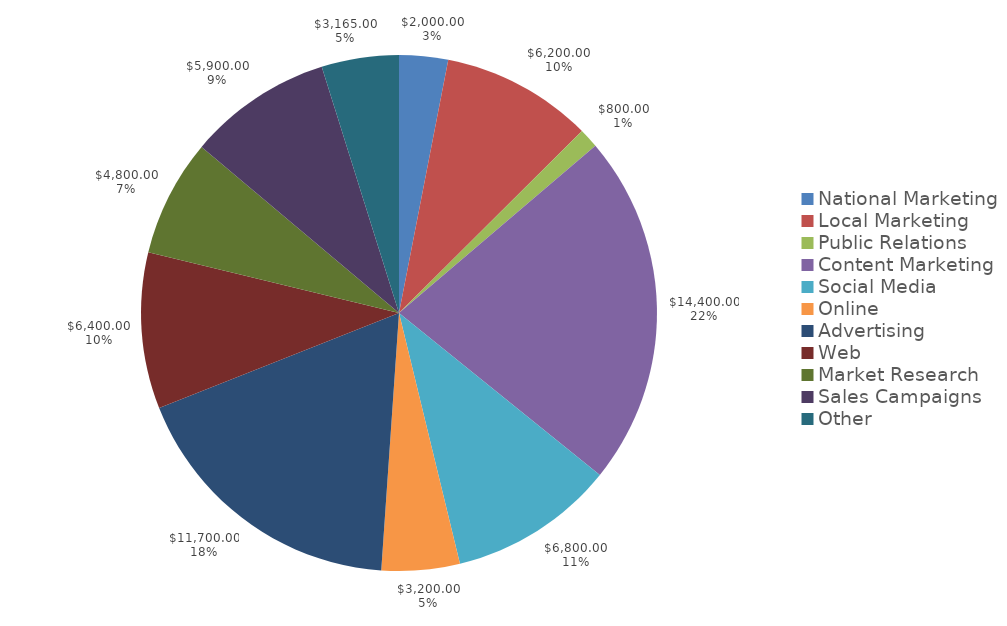
| Category | Series 0 | Series 1 |
|---|---|---|
| National Marketing | 2000 | 0.031 |
| Local Marketing | 6200 | 0.095 |
| Public Relations | 800 | 0.012 |
| Content Marketing | 14400 | 0.22 |
| Social Media | 6800 | 0.104 |
| Online | 3200 | 0.049 |
| Advertising | 11700 | 0.179 |
| Web | 6400 | 0.098 |
| Market Research | 4800 | 0.073 |
| Sales Campaigns | 5900 | 0.09 |
| Other | 3165 | 0.048 |